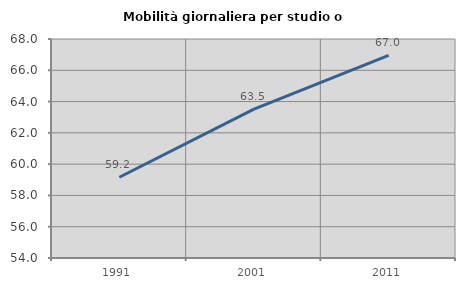
| Category | Mobilità giornaliera per studio o lavoro |
|---|---|
| 1991.0 | 59.164 |
| 2001.0 | 63.516 |
| 2011.0 | 66.954 |